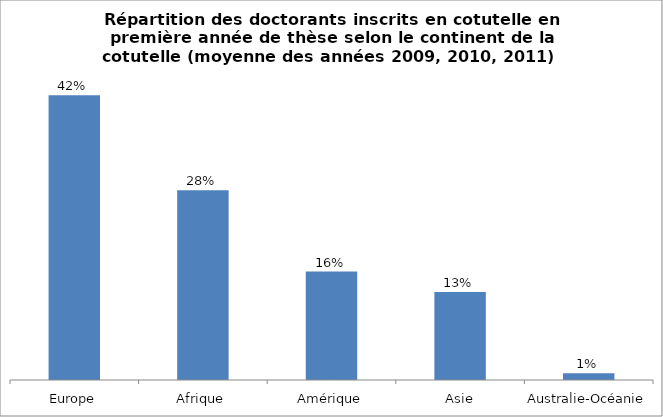
| Category | Series 0 |
|---|---|
| Europe | 0.42 |
| Afrique | 0.28 |
| Amérique | 0.16 |
| Asie | 0.13 |
| Australie-Océanie | 0.01 |